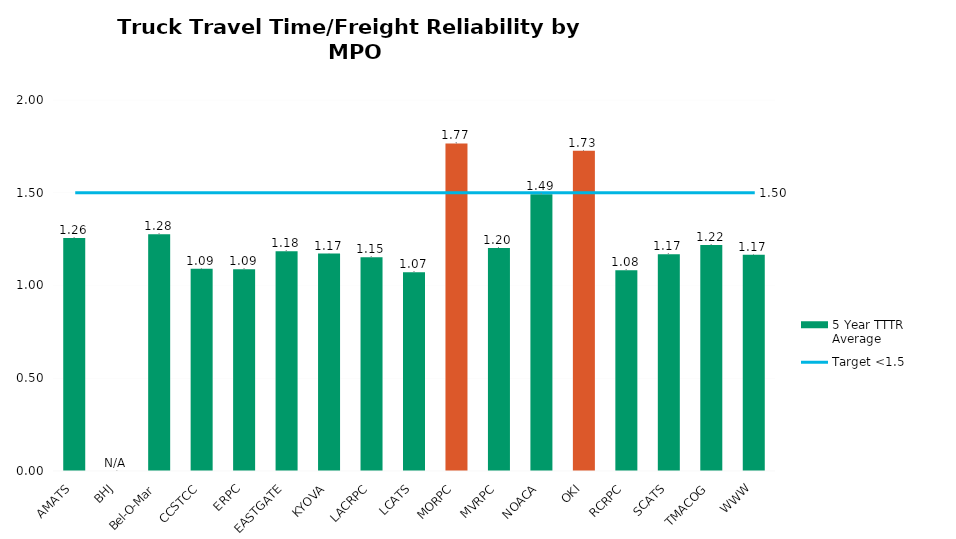
| Category | 5 Year TTTR Average |
|---|---|
| AMATS | 1.256 |
| BHJ | 0 |
| Bel-O-Mar | 1.276 |
| CCSTCC | 1.09 |
| ERPC | 1.088 |
| EASTGATE | 1.184 |
| KYOVA | 1.172 |
| LACRPC | 1.152 |
| LCATS | 1.072 |
| MORPC | 1.766 |
| MVRPC | 1.202 |
| NOACA | 1.492 |
| OKI | 1.726 |
| RCRPC | 1.082 |
| SCATS | 1.168 |
| TMACOG | 1.218 |
| WWW | 1.166 |